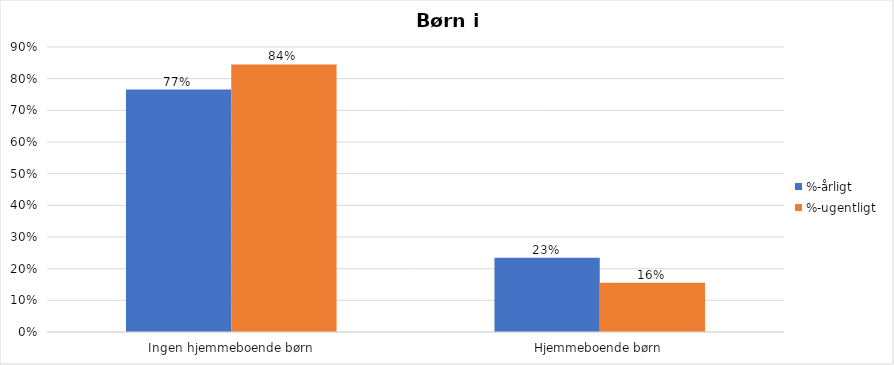
| Category | %-årligt | %-ugentligt |
|---|---|---|
| Ingen hjemmeboende børn | 0.766 | 0.845 |
| Hjemmeboende børn | 0.234 | 0.155 |